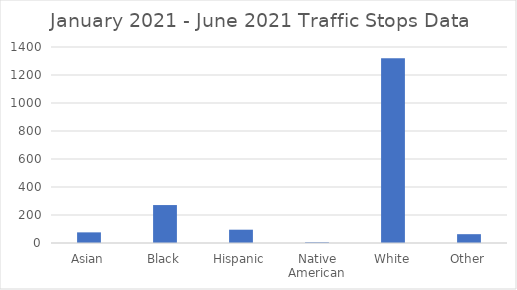
| Category | Series 0 |
|---|---|
| Asian | 76 |
| Black | 271 |
| Hispanic | 95 |
| Native American | 5 |
| White | 1319 |
| Other | 63 |